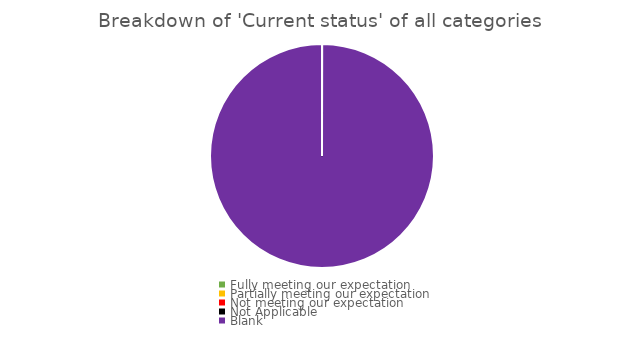
| Category | Series 0 |
|---|---|
| Fully meeting our expectation | 0 |
| Partially meeting our expectation | 0 |
| Not meeting our expectation | 0 |
| Not Applicable | 0 |
| Blank | 290 |